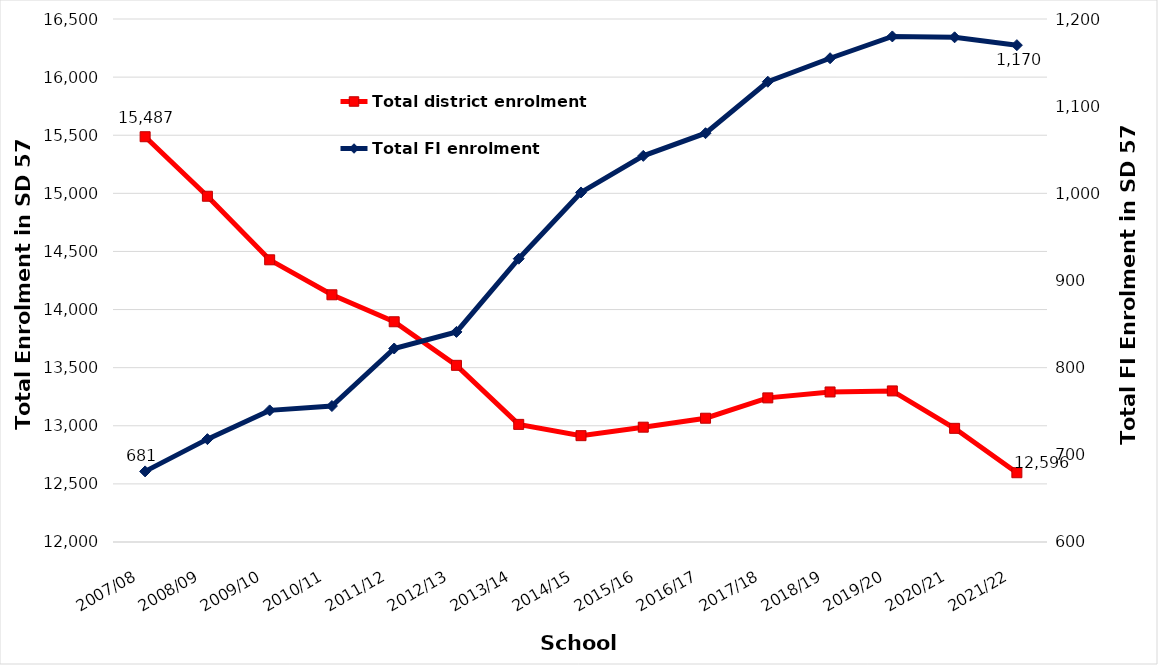
| Category | Total district enrolment  |
|---|---|
| 2007/08 | 15487 |
| 2008/09 | 14975 |
| 2009/10 | 14428 |
| 2010/11 | 14127 |
| 2011/12 | 13895 |
| 2012/13 | 13520 |
| 2013/14 | 13012 |
| 2014/15 | 12915 |
| 2015/16 | 12988 |
| 2016/17 | 13065 |
| 2017/18 | 13240 |
| 2018/19 | 13291 |
| 2019/20 | 13300 |
| 2020/21 | 12978 |
| 2021/22 | 12596 |